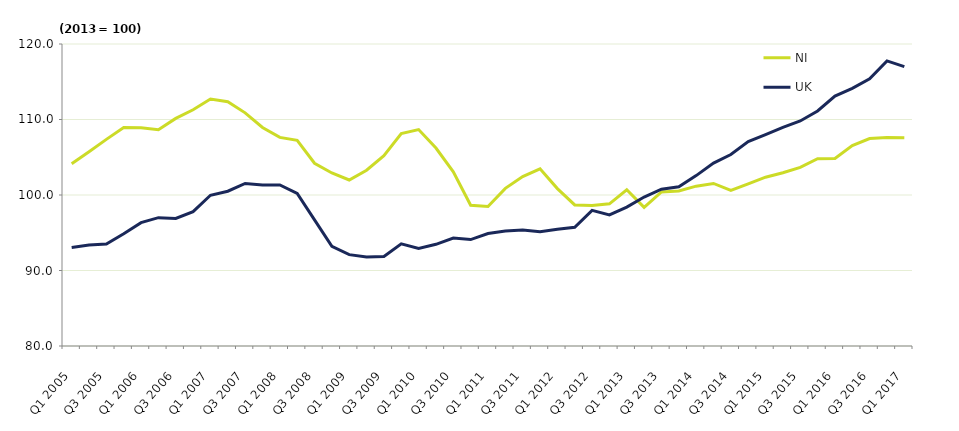
| Category | NI  | UK  |
|---|---|---|
| Q1 2005 | 104.132 | 93.033 |
| Q2 2005 | 105.729 | 93.367 |
| Q3 2005 | 107.369 | 93.5 |
| Q4 2005 | 108.926 | 94.867 |
| Q1 2006 | 108.892 | 96.333 |
| Q2 2006 | 108.653 | 97 |
| Q3 2006 | 110.142 | 96.9 |
| Q4 2006 | 111.291 | 97.8 |
| Q1 2007 | 112.71 | 99.967 |
| Q2 2007 | 112.356 | 100.5 |
| Q3 2007 | 110.883 | 101.533 |
| Q4 2007 | 108.938 | 101.333 |
| Q1 2008 | 107.627 | 101.333 |
| Q2 2008 | 107.244 | 100.2 |
| Q3 2008 | 104.203 | 96.7 |
| Q4 2008 | 102.913 | 93.2 |
| Q1 2009 | 101.989 | 92.1 |
| Q2 2009 | 103.286 | 91.8 |
| Q3 2009 | 105.195 | 91.867 |
| Q4 2009 | 108.147 | 93.533 |
| Q1 2010 | 108.668 | 92.933 |
| Q2 2010 | 106.222 | 93.467 |
| Q3 2010 | 103.07 | 94.3 |
| Q4 2010 | 98.637 | 94.1 |
| Q1 2011 | 98.474 | 94.9 |
| Q2 2011 | 100.877 | 95.233 |
| Q3 2011 | 102.444 | 95.367 |
| Q4 2011 | 103.46 | 95.133 |
| Q1 2012 | 100.85 | 95.467 |
| Q2 2012 | 98.688 | 95.733 |
| Q3 2012 | 98.601 | 97.967 |
| Q4 2012 | 98.83 | 97.367 |
| Q1 2013 | 100.687 | 98.4 |
| Q2 2013 | 98.369 | 99.733 |
| Q3 2013 | 100.411 | 100.767 |
| Q4 2013 | 100.533 | 101.1 |
| Q1 2014 | 101.173 | 102.567 |
| Q2 2014 | 101.533 | 104.233 |
| Q3 2014 | 100.604 | 105.367 |
| Q4 2014 | 101.478 | 107.067 |
| Q1 2015 | 102.356 | 108 |
| Q2 2015 | 102.939 | 108.967 |
| Q3 2015 | 103.65 | 109.8 |
| Q4 2015 | 104.798 | 111.133 |
| Q1 2016 | 104.836 | 113.1 |
| Q2 2016 | 106.545 | 114.133 |
| Q3 2016 | 107.476 | 115.4 |
| Q4 2016 | 107.616 | 117.767 |
| Q1 2017 | 107.573 | 117 |